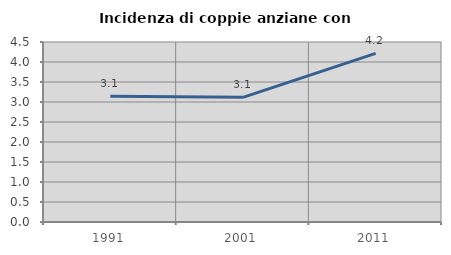
| Category | Incidenza di coppie anziane con figli |
|---|---|
| 1991.0 | 3.141 |
| 2001.0 | 3.117 |
| 2011.0 | 4.215 |